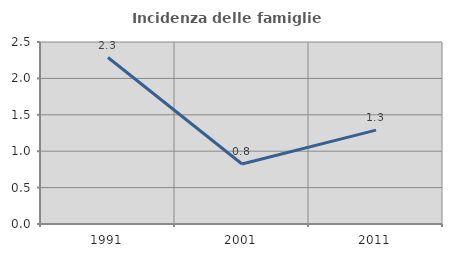
| Category | Incidenza delle famiglie numerose |
|---|---|
| 1991.0 | 2.287 |
| 2001.0 | 0.824 |
| 2011.0 | 1.289 |